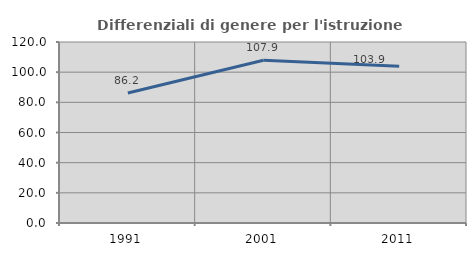
| Category | Differenziali di genere per l'istruzione superiore |
|---|---|
| 1991.0 | 86.197 |
| 2001.0 | 107.863 |
| 2011.0 | 103.878 |